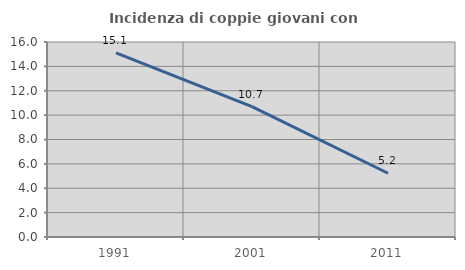
| Category | Incidenza di coppie giovani con figli |
|---|---|
| 1991.0 | 15.111 |
| 2001.0 | 10.7 |
| 2011.0 | 5.229 |